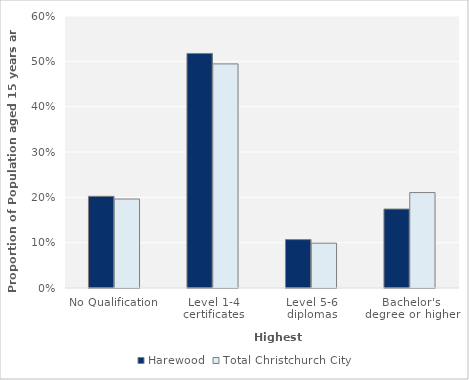
| Category | Harewood | Total Christchurch City |
|---|---|---|
| No Qualification | 0.202 | 0.196 |
| Level 1-4 certificates | 0.517 | 0.494 |
| Level 5-6 diplomas | 0.107 | 0.099 |
| Bachelor's degree or higher | 0.174 | 0.211 |